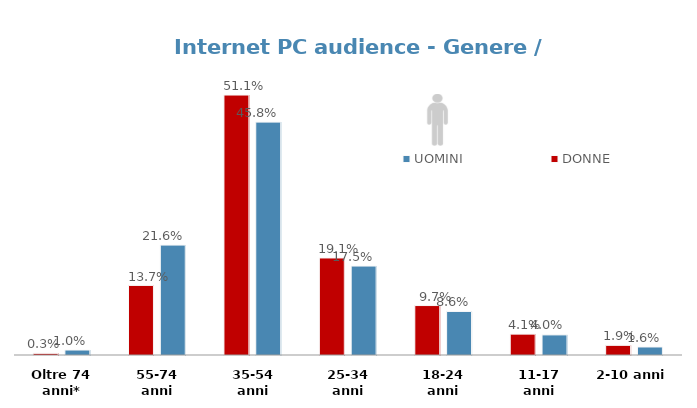
| Category | UOMINI | DONNE |
|---|---|---|
| 2-10 anni | 0.016 | 0.019 |
| 11-17 anni | 0.04 | 0.041 |
| 18-24 anni | 0.086 | 0.097 |
| 25-34 anni | 0.175 | 0.191 |
| 35-54 anni | 0.458 | 0.511 |
| 55-74 anni | 0.216 | 0.137 |
| Oltre 74 anni* | 0.01 | 0.003 |